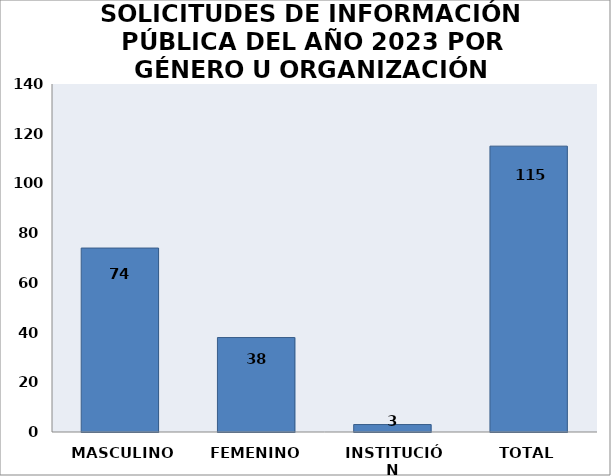
| Category | Series 0 |
|---|---|
| MASCULINO | 74 |
| FEMENINO | 38 |
| INSTITUCIÓN | 3 |
| TOTAL | 115 |